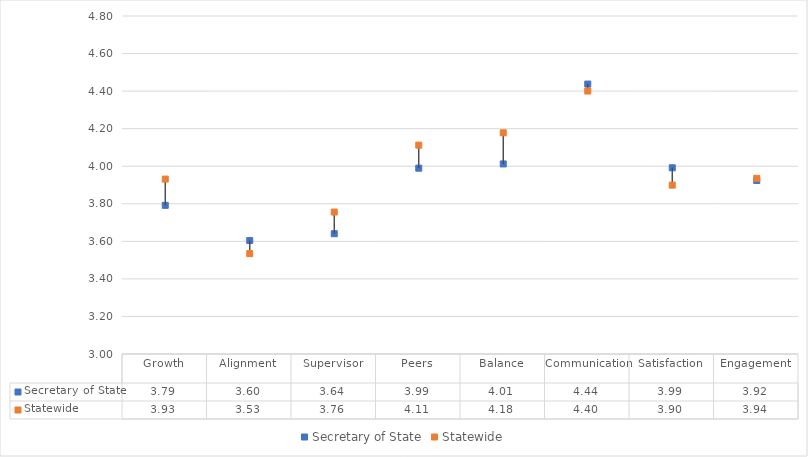
| Category | Secretary of State | Statewide |
|---|---|---|
| Growth | 3.792 | 3.931 |
| Alignment | 3.604 | 3.534 |
| Supervisor | 3.641 | 3.756 |
| Peers | 3.99 | 4.112 |
| Balance | 4.012 | 4.178 |
| Communication | 4.438 | 4.4 |
| Satisfaction | 3.992 | 3.899 |
| Engagement | 3.924 | 3.936 |